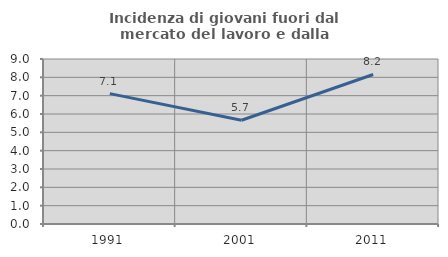
| Category | Incidenza di giovani fuori dal mercato del lavoro e dalla formazione  |
|---|---|
| 1991.0 | 7.113 |
| 2001.0 | 5.658 |
| 2011.0 | 8.156 |